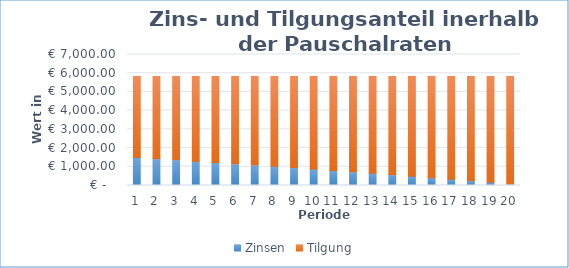
| Category | Zinsen | Tilgung |
|---|---|---|
| 0 | 1500 | 4324.574 |
| 1 | 1435.131 | 4389.442 |
| 2 | 1369.29 | 4455.284 |
| 3 | 1302.461 | 4522.113 |
| 4 | 1234.629 | 4589.945 |
| 5 | 1165.78 | 4658.794 |
| 6 | 1095.898 | 4728.676 |
| 7 | 1024.968 | 4799.606 |
| 8 | 952.974 | 4871.6 |
| 9 | 879.899 | 4944.674 |
| 10 | 805.729 | 5018.844 |
| 11 | 730.447 | 5094.127 |
| 12 | 654.035 | 5170.539 |
| 13 | 576.477 | 5248.097 |
| 14 | 497.755 | 5326.818 |
| 15 | 417.853 | 5406.721 |
| 16 | 336.752 | 5487.821 |
| 17 | 254.435 | 5570.139 |
| 18 | 170.883 | 5653.691 |
| 19 | 86.077 | 5738.496 |